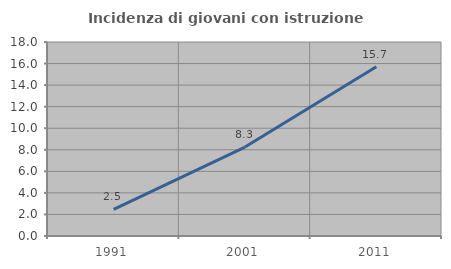
| Category | Incidenza di giovani con istruzione universitaria |
|---|---|
| 1991.0 | 2.468 |
| 2001.0 | 8.256 |
| 2011.0 | 15.712 |